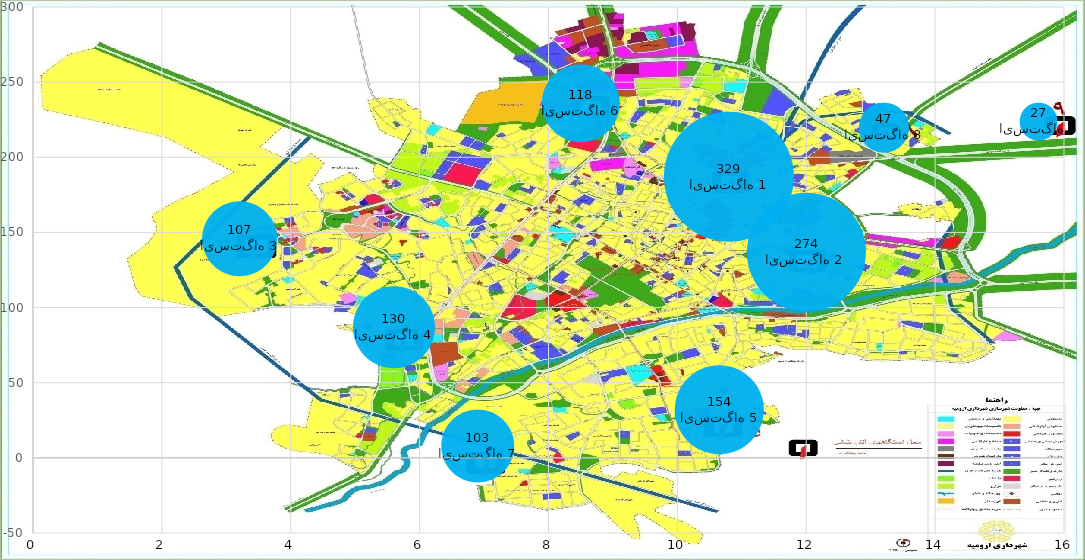
| Category | تعداد |
|---|---|
| 10.8 | 187 |
| 12.0 | 137 |
| 3.2 | 146 |
| 5.6 | 87 |
| 10.65 | 32 |
| 8.5 | 236 |
| 6.9 | 8 |
| 13.2 | 220 |
| 15.6 | 224 |